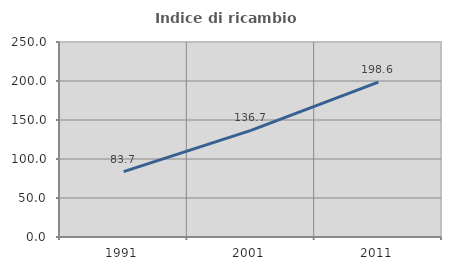
| Category | Indice di ricambio occupazionale  |
|---|---|
| 1991.0 | 83.721 |
| 2001.0 | 136.667 |
| 2011.0 | 198.592 |